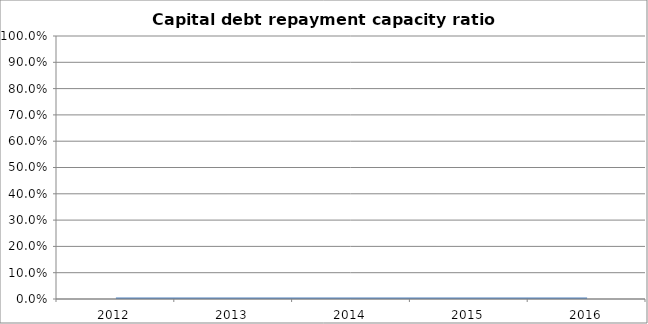
| Category | Capital debt repayment capacity ratio [(I+K+L+M-N)/F] |
|---|---|
| 2012.0 | 0 |
| 2013.0 | 0 |
| 2014.0 | 0 |
| 2015.0 | 0 |
| 2016.0 | 0 |